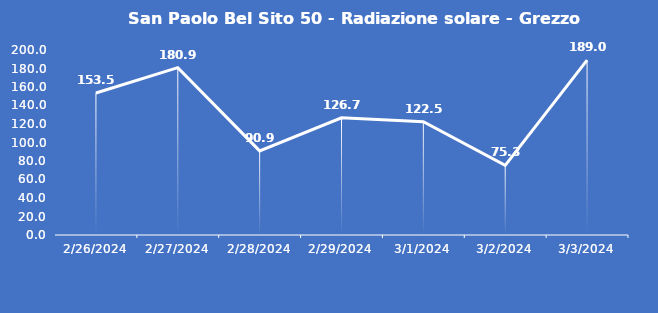
| Category | San Paolo Bel Sito 50 - Radiazione solare - Grezzo (W/m2) |
|---|---|
| 2/26/24 | 153.5 |
| 2/27/24 | 180.9 |
| 2/28/24 | 90.9 |
| 2/29/24 | 126.7 |
| 3/1/24 | 122.5 |
| 3/2/24 | 75.3 |
| 3/3/24 | 189 |